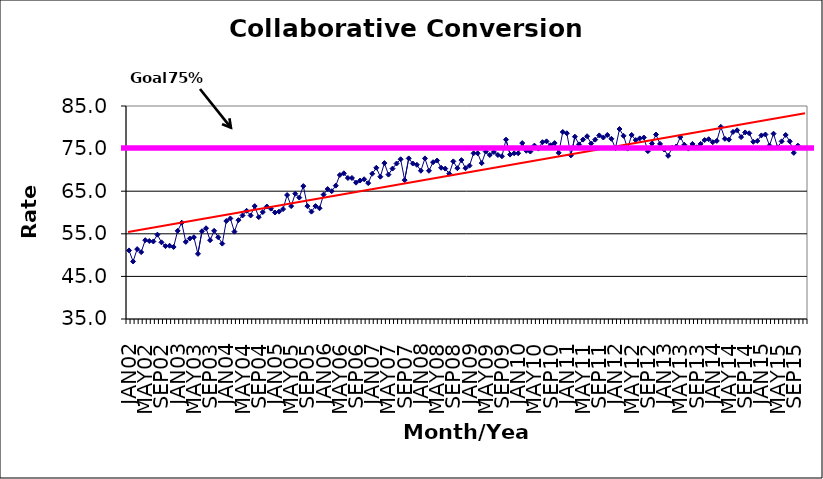
| Category | Series 0 |
|---|---|
| JAN02 | 51.1 |
| FEB02 | 48.5 |
| MAR02 | 51.4 |
| APR02 | 50.7 |
| MAY02 | 53.5 |
| JUN02 | 53.3 |
| JUL02 | 53.2 |
| AUG02 | 54.8 |
| SEP02 | 53 |
| OCT02 | 52.1 |
| NOV02 | 52.2 |
| DEC02 | 51.9 |
| JAN03 | 55.7 |
| FEB03 | 57.6 |
| MAR03 | 53.1 |
| APR03 | 53.9 |
| MAY03 | 54.2 |
| JUN03 | 50.3 |
| JUL03 | 55.6 |
| AUG03 | 56.3 |
| SEP03 | 53.5 |
| OCT03 | 55.7 |
| NOV03 | 54.2 |
| DEC03 | 52.7 |
| JAN04 | 58 |
| FEB04 | 58.6 |
| MAR04 | 55.5 |
| APR04 | 58.2 |
| MAY04 | 59.3 |
| JUN04 | 60.4 |
| JUL04 | 59.3 |
| AUG04 | 61.5 |
| SEP04 | 58.9 |
| OCT04 | 60.1 |
| NOV04 | 61.4 |
| DEC04 | 60.9 |
| JAN05 | 60 |
| FEB05 | 60.2 |
| MAR05 | 60.8 |
| APR05 | 64.1 |
| MAY05 | 61.5 |
| JUN05 | 64.4 |
| JUL05 | 63.5 |
| AUG05 | 66.2 |
| SEP05 | 61.5 |
| OCT05 | 60.2 |
| NOV05 | 61.5 |
| DEC05 | 61 |
| JAN06 | 64.2 |
| FEB06 | 65.5 |
| MAR06 | 65 |
| APR06 | 66.3 |
| MAY06 | 68.8 |
| JUN06 | 69.2 |
| JUL06 | 68.1 |
| AUG06 | 68.1 |
| SEP06 | 67 |
| OCT06 | 67.5 |
| NOV06 | 67.8 |
| DEC06 | 66.9 |
| JAN07 | 69.1 |
| FEB07 | 70.5 |
| MAR07 | 68.4 |
| APR07 | 71.6 |
| MAY07 | 68.9 |
| JUN07 | 70.3 |
| JUL07 | 71.5 |
| AUG07 | 72.5 |
| SEP07 | 67.6 |
| OCT07 | 72.7 |
| NOV07 | 71.5 |
| DEC07 | 71.2 |
| JAN08 | 69.8 |
| FEB08 | 72.7 |
| MAR08 | 69.8 |
| APR08 | 71.8 |
| MAY08 | 72.2 |
| JUN08 | 70.5 |
| JUL08 | 70.3 |
| AUG08 | 69.1 |
| SEP08 | 72 |
| OCT08 | 70.4 |
| NOV08 | 72.3 |
| DEC08 | 70.4 |
| JAN09 | 71 |
| FEB09 | 73.9 |
| MAR09 | 73.9 |
| APR09 | 71.6 |
| MAY09 | 74.3 |
| JUN09 | 73.5 |
| JUL09 | 74.2 |
| AUG09 | 73.5 |
| SEP09 | 73.2 |
| OCT09 | 77.1 |
| NOV09 | 73.6 |
| DEC09 | 73.9 |
| JAN10 | 73.9 |
| FEB10 | 76.3 |
| MAR10 | 74.5 |
| APR10 | 74.3 |
| MAY10 | 75.7 |
| JUN10 | 75 |
| JUL10 | 76.5 |
| AUG10 | 76.7 |
| SEP10 | 75.8 |
| OCT10 | 76.3 |
| NOV10 | 74 |
| DEC10 | 78.9 |
| JAN11 | 78.6 |
| FEB11 | 73.4 |
| MAR11 | 77.8 |
| APR11 | 76 |
| MAY11 | 77.1 |
| JUN11 | 77.9 |
| JUL11 | 76.2 |
| AUG11 | 77.1 |
| SEP11 | 78.1 |
| OCT11 | 77.6 |
| NOV11 | 78.2 |
| DEC11 | 77.3 |
| JAN12 | 75.1 |
| FEB12 | 79.6 |
| MAR12 | 78 |
| APR12 | 75 |
| MAY12 | 78.2 |
| JUN12 | 77 |
| JUL12 | 77.4 |
| AUG12 | 77.6 |
| SEP12 | 74.4 |
| OCT12 | 76.2 |
| NOV12 | 78.3 |
| DEC12 | 76.1 |
| JAN13 | 74.8 |
| FEB13 | 73.3 |
| MAR13 | 75.2 |
| APR13 | 75.5 |
| MAY13 | 77.7 |
| JUN13 | 75.9 |
| JUL13 | 75 |
| AUG13 | 76.1 |
| SEP13 | 75.3 |
| OCT13 | 76.1 |
| NOV13 | 77 |
| DEC13 | 77.2 |
| JAN14 | 76.5 |
| FEB14 | 76.8 |
| MAR14 | 80.1 |
| APR14 | 77.3 |
| MAY14 | 77.1 |
| JUN14 | 78.9 |
| JUL14 | 79.3 |
| AUG14 | 77.7 |
| SEP14 | 78.8 |
| OCT14 | 78.6 |
| NOV14 | 76.6 |
| DEC14 | 76.8 |
| JAN15 | 78.1 |
| FEB15 | 78.3 |
| MAR15 | 75.7 |
| APR15 | 78.5 |
| MAY15 | 75.3 |
| JUN15 | 76.7 |
| JUL15 | 78.2 |
| AUG15 | 76.7 |
| SEP15 | 74 |
| OCT15 | 75.7 |